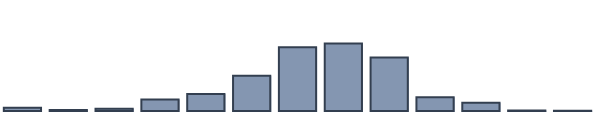
| Category | Series 0 |
|---|---|
| 0 | 1.204 |
| 1 | 0.334 |
| 2 | 0.814 |
| 3 | 4.153 |
| 4 | 6.165 |
| 5 | 12.674 |
| 6 | 22.941 |
| 7 | 24.297 |
| 8 | 19.239 |
| 9 | 4.913 |
| 10 | 3 |
| 11 | 0.214 |
| 12 | 0.052 |